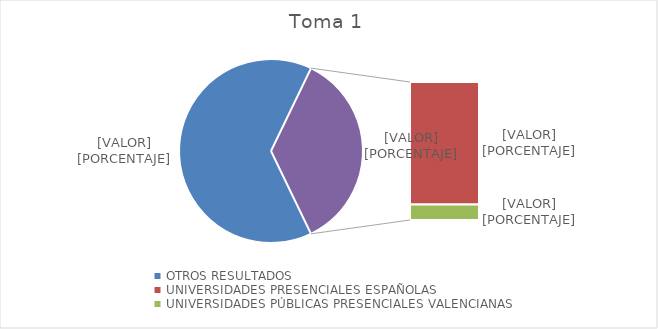
| Category | Series 0 |
|---|---|
| OTROS RESULTADOS | 3731 |
| UNIVERSIDADES PRESENCIALES ESPAÑOLAS  | 1836 |
| UNIVERSIDADES PÚBLICAS PRESENCIALES VALENCIANAS | 233 |